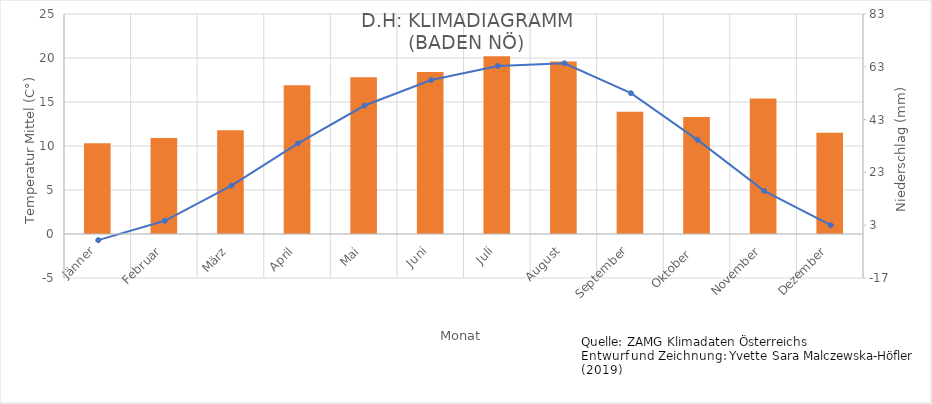
| Category | Niederschlag |
|---|---|
| Jänner | 34 |
| Februar | 36 |
| März | 39 |
| April | 56 |
| Mai | 59 |
| Juni | 61 |
| Juli | 67 |
| August | 65 |
| September | 46 |
| Oktober  | 44 |
| November | 51 |
| Dezember | 38 |